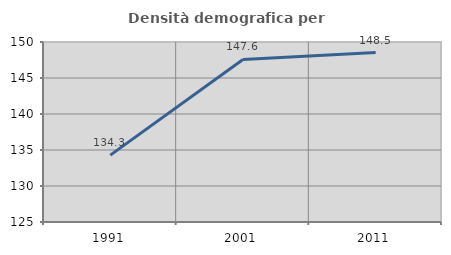
| Category | Densità demografica |
|---|---|
| 1991.0 | 134.29 |
| 2001.0 | 147.573 |
| 2011.0 | 148.53 |